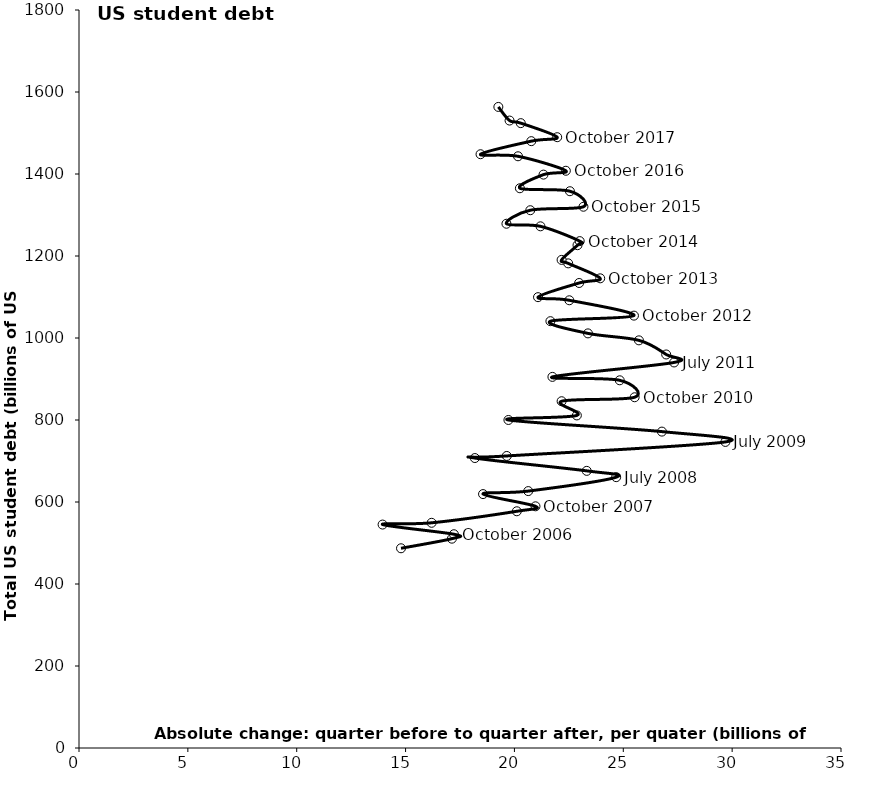
| Category | Series 0 |
|---|---|
| 14.790750000000003 | 487.126 |
| 17.128250000000037 | 510.548 |
| 17.220000000000027 | 521.383 |
| 13.94414999999998 | 544.988 |
| 16.196049999999957 | 549.271 |
| 20.109249999999975 | 577.381 |
| 20.96765000000005 | 589.489 |
| 18.558150000000012 | 619.316 |
| 20.634149999999977 | 626.606 |
| 24.67349999999999 | 660.584 |
| 23.321300000000008 | 675.953 |
| 18.18330000000003 | 707.227 |
| 19.647850000000005 | 712.319 |
| 29.690249999999992 | 746.522 |
| 26.773649999999975 | 771.7 |
| 19.724550000000022 | 800.07 |
| 22.867500000000007 | 811.149 |
| 22.167299999999955 | 845.805 |
| 25.521799999999985 | 855.483 |
| 24.836900000000014 | 896.848 |
| 21.745300000000043 | 905.157 |
| 27.333399999999983 | 940.339 |
| 26.970349999999996 | 959.824 |
| 25.71795000000003 | 994.28 |
| 23.37715000000003 | 1011.26 |
| 21.652600000000007 | 1041.034 |
| 25.489949999999908 | 1054.565 |
| 22.520849999999996 | 1092.014 |
| 21.08355000000006 | 1099.607 |
| 22.97199999999998 | 1134.181 |
| 23.94010000000003 | 1145.551 |
| 22.468950000000063 | 1182.061 |
| 22.16644999999994 | 1190.489 |
| 22.89765 | 1226.394 |
| 22.998450000000048 | 1236.284 |
| 21.1964999999999 | 1272.391 |
| 19.6336 | 1278.677 |
| 20.728900000000067 | 1311.658 |
| 23.17025000000001 | 1320.135 |
| 22.548749999999927 | 1357.999 |
| 20.251049999999964 | 1365.232 |
| 21.33510000000001 | 1398.501 |
| 22.36175000000003 | 1407.902 |
| 20.165000000000077 | 1443.224 |
| 18.44304999999997 | 1448.232 |
| 20.77469999999994 | 1480.11 |
| 21.96460000000002 | 1489.782 |
| 20.29155000000003 | 1524.04 |
| 19.77654999999993 | 1530.365 |
| 19.26154999999983 | 1563.593 |